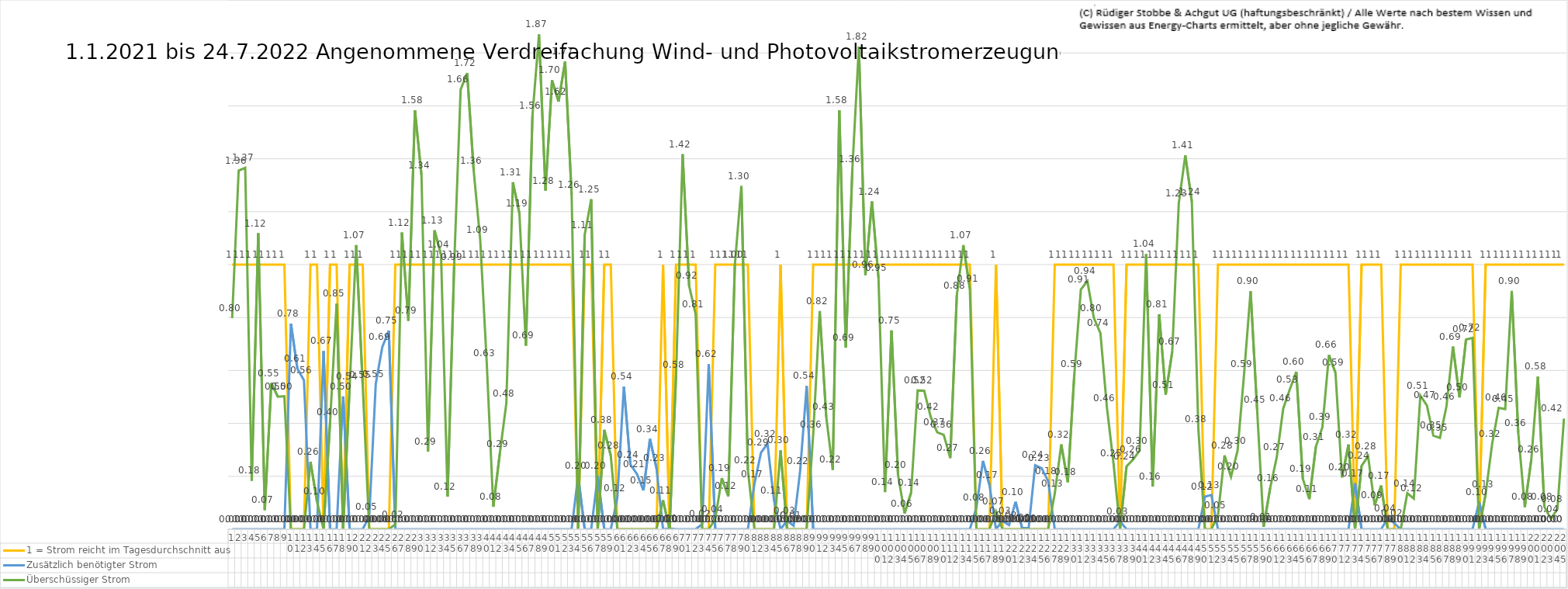
| Category | 1 = Strom reicht im Tagesdurchschnitt aus | Zusätzlich benötigter Strom | Überschüssiger Strom |
|---|---|---|---|
| 0 | 1 | 0 | 0.798 |
| 1 | 1 | 0 | 1.356 |
| 2 | 1 | 0 | 1.366 |
| 3 | 1 | 0 | 0.184 |
| 4 | 1 | 0 | 1.118 |
| 5 | 1 | 0 | 0.073 |
| 6 | 1 | 0 | 0.553 |
| 7 | 1 | 0 | 0.501 |
| 8 | 1 | 0 | 0.503 |
| 9 | 0 | 0.777 | 0 |
| 10 | 0 | 0.606 | 0 |
| 11 | 0 | 0.563 | 0 |
| 12 | 1 | 0 | 0.255 |
| 13 | 1 | 0 | 0.104 |
| 14 | 0 | 0.673 | 0 |
| 15 | 1 | 0 | 0.405 |
| 16 | 1 | 0 | 0.852 |
| 17 | 0 | 0.502 | 0 |
| 18 | 1 | 0 | 0.54 |
| 19 | 1 | 0 | 1.074 |
| 20 | 1 | 0 | 0.546 |
| 21 | 0 | 0.048 | 0 |
| 22 | 0 | 0.55 | 0 |
| 23 | 0 | 0.688 | 0 |
| 24 | 0 | 0.751 | 0 |
| 25 | 1 | 0 | 0.018 |
| 26 | 1 | 0 | 1.121 |
| 27 | 1 | 0 | 0.788 |
| 28 | 1 | 0 | 1.583 |
| 29 | 1 | 0 | 1.338 |
| 30 | 1 | 0 | 0.293 |
| 31 | 1 | 0 | 1.13 |
| 32 | 1 | 0 | 1.037 |
| 33 | 1 | 0 | 0.123 |
| 34 | 1 | 0 | 0.992 |
| 35 | 1 | 0 | 1.662 |
| 36 | 1 | 0 | 1.724 |
| 37 | 1 | 0 | 1.355 |
| 38 | 1 | 0 | 1.094 |
| 39 | 1 | 0 | 0.628 |
| 40 | 1 | 0 | 0.085 |
| 41 | 1 | 0 | 0.286 |
| 42 | 1 | 0 | 0.476 |
| 43 | 1 | 0 | 1.311 |
| 44 | 1 | 0 | 1.194 |
| 45 | 1 | 0 | 0.694 |
| 46 | 1 | 0 | 1.563 |
| 47 | 1 | 0 | 1.87 |
| 48 | 1 | 0 | 1.28 |
| 49 | 1 | 0 | 1.697 |
| 50 | 1 | 0 | 1.616 |
| 51 | 1 | 0 | 1.767 |
| 52 | 1 | 0 | 1.264 |
| 53 | 0 | 0.202 | 0 |
| 54 | 1 | 0 | 1.112 |
| 55 | 1 | 0 | 1.247 |
| 56 | 0 | 0.202 | 0 |
| 57 | 1 | 0 | 0.376 |
| 58 | 1 | 0 | 0.278 |
| 59 | 0 | 0.118 | 0 |
| 60 | 0 | 0.538 | 0 |
| 61 | 0 | 0.244 | 0 |
| 62 | 0 | 0.209 | 0 |
| 63 | 0 | 0.147 | 0 |
| 64 | 0 | 0.341 | 0 |
| 65 | 0 | 0.231 | 0 |
| 66 | 1 | 0 | 0.11 |
| 67 | 0 | 0.003 | 0 |
| 68 | 1 | 0 | 0.584 |
| 69 | 1 | 0 | 1.417 |
| 70 | 1 | 0 | 0.92 |
| 71 | 1 | 0 | 0.813 |
| 72 | 0 | 0.019 | 0 |
| 73 | 0 | 0.624 | 0 |
| 74 | 1 | 0 | 0.038 |
| 75 | 1 | 0 | 0.193 |
| 76 | 1 | 0 | 0.125 |
| 77 | 1 | 0 | 0.999 |
| 78 | 1 | 0 | 1.297 |
| 79 | 1 | 0 | 0.224 |
| 80 | 0 | 0.171 | 0 |
| 81 | 0 | 0.289 | 0 |
| 82 | 0 | 0.323 | 0 |
| 83 | 0 | 0.11 | 0 |
| 84 | 1 | 0 | 0.298 |
| 85 | 0 | 0.032 | 0 |
| 86 | 0 | 0.013 | 0 |
| 87 | 0 | 0.22 | 0 |
| 88 | 0 | 0.541 | 0 |
| 89 | 1 | 0 | 0.357 |
| 90 | 1 | 0 | 0.825 |
| 91 | 1 | 0 | 0.425 |
| 92 | 1 | 0 | 0.225 |
| 93 | 1 | 0 | 1.583 |
| 94 | 1 | 0 | 0.686 |
| 95 | 1 | 0 | 1.361 |
| 96 | 1 | 0 | 1.824 |
| 97 | 1 | 0 | 0.96 |
| 98 | 1 | 0 | 1.239 |
| 99 | 1 | 0 | 0.951 |
| 100 | 1 | 0 | 0.14 |
| 101 | 1 | 0 | 0.751 |
| 102 | 1 | 0 | 0.205 |
| 103 | 1 | 0 | 0.06 |
| 104 | 1 | 0 | 0.138 |
| 105 | 1 | 0 | 0.525 |
| 106 | 1 | 0 | 0.524 |
| 107 | 1 | 0 | 0.425 |
| 108 | 1 | 0 | 0.366 |
| 109 | 1 | 0 | 0.357 |
| 110 | 1 | 0 | 0.269 |
| 111 | 1 | 0 | 0.884 |
| 112 | 1 | 0 | 1.074 |
| 113 | 1 | 0 | 0.908 |
| 114 | 0 | 0.082 | 0 |
| 115 | 0 | 0.258 | 0 |
| 116 | 0 | 0.168 | 0 |
| 117 | 1 | 0 | 0.068 |
| 118 | 0 | 0.031 | 0 |
| 119 | 0 | 0.016 | 0 |
| 120 | 0 | 0.104 | 0 |
| 121 | 0 | 0.005 | 0 |
| 122 | 0 | 0.003 | 0 |
| 123 | 0 | 0.242 | 0 |
| 124 | 0 | 0.23 | 0 |
| 125 | 0 | 0.181 | 0 |
| 126 | 1 | 0 | 0.134 |
| 127 | 1 | 0 | 0.321 |
| 128 | 1 | 0 | 0.178 |
| 129 | 1 | 0 | 0.585 |
| 130 | 1 | 0 | 0.906 |
| 131 | 1 | 0 | 0.937 |
| 132 | 1 | 0 | 0.798 |
| 133 | 1 | 0 | 0.741 |
| 134 | 1 | 0 | 0.458 |
| 135 | 1 | 0 | 0.25 |
| 136 | 0 | 0.03 | 0 |
| 137 | 1 | 0 | 0.238 |
| 138 | 1 | 0 | 0.263 |
| 139 | 1 | 0 | 0.298 |
| 140 | 1 | 0 | 1.04 |
| 141 | 1 | 0 | 0.161 |
| 142 | 1 | 0 | 0.812 |
| 143 | 1 | 0 | 0.509 |
| 144 | 1 | 0 | 0.672 |
| 145 | 1 | 0 | 1.232 |
| 146 | 1 | 0 | 1.413 |
| 147 | 1 | 0 | 1.238 |
| 148 | 1 | 0 | 0.379 |
| 149 | 0 | 0.123 | 0 |
| 150 | 0 | 0.129 | 0 |
| 151 | 1 | 0 | 0.052 |
| 152 | 1 | 0 | 0.279 |
| 153 | 1 | 0 | 0.199 |
| 154 | 1 | 0 | 0.296 |
| 155 | 1 | 0 | 0.585 |
| 156 | 1 | 0 | 0.899 |
| 157 | 1 | 0 | 0.452 |
| 158 | 1 | 0 | 0.009 |
| 159 | 1 | 0 | 0.156 |
| 160 | 1 | 0 | 0.272 |
| 161 | 1 | 0 | 0.456 |
| 162 | 1 | 0 | 0.528 |
| 163 | 1 | 0 | 0.595 |
| 164 | 1 | 0 | 0.191 |
| 165 | 1 | 0 | 0.114 |
| 166 | 1 | 0 | 0.312 |
| 167 | 1 | 0 | 0.386 |
| 168 | 1 | 0 | 0.659 |
| 169 | 1 | 0 | 0.592 |
| 170 | 1 | 0 | 0.196 |
| 171 | 1 | 0 | 0.32 |
| 172 | 0 | 0.174 | 0 |
| 173 | 1 | 0 | 0.24 |
| 174 | 1 | 0 | 0.276 |
| 175 | 1 | 0 | 0.09 |
| 176 | 1 | 0 | 0.165 |
| 177 | 0 | 0.041 | 0 |
| 178 | 0 | 0.023 | 0 |
| 179 | 1 | 0 | 0 |
| 180 | 1 | 0 | 0.136 |
| 181 | 1 | 0 | 0.116 |
| 182 | 1 | 0 | 0.505 |
| 183 | 1 | 0 | 0.468 |
| 184 | 1 | 0 | 0.354 |
| 185 | 1 | 0 | 0.345 |
| 186 | 1 | 0 | 0.464 |
| 187 | 1 | 0 | 0.69 |
| 188 | 1 | 0 | 0.498 |
| 189 | 1 | 0 | 0.717 |
| 190 | 1 | 0 | 0.723 |
| 191 | 0 | 0.104 | 0 |
| 192 | 1 | 0 | 0.132 |
| 193 | 1 | 0 | 0.323 |
| 194 | 1 | 0 | 0.459 |
| 195 | 1 | 0 | 0.454 |
| 196 | 1 | 0 | 0.901 |
| 197 | 1 | 0 | 0.364 |
| 198 | 1 | 0 | 0.084 |
| 199 | 1 | 0 | 0.264 |
| 200 | 1 | 0 | 0.577 |
| 201 | 1 | 0 | 0.085 |
| 202 | 1 | 0 | 0.039 |
| 203 | 1 | 0 | 0.077 |
| 204 | 1 | 0 | 0.418 |